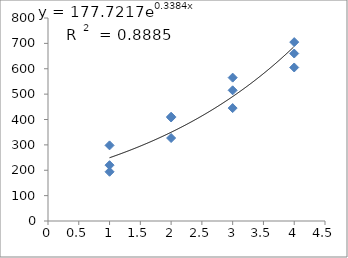
| Category | Series 0 |
|---|---|
| 1.0 | 298 |
| 1.0 | 220 |
| 1.0 | 194 |
| 2.0 | 411 |
| 2.0 | 327 |
| 2.0 | 408 |
| 3.0 | 515 |
| 3.0 | 565 |
| 3.0 | 445 |
| 4.0 | 660 |
| 4.0 | 705 |
| 4.0 | 605 |